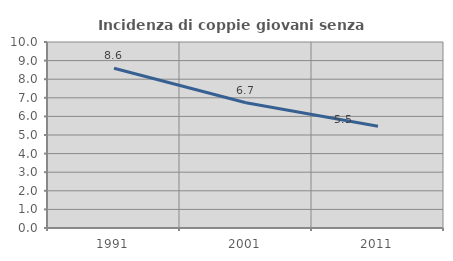
| Category | Incidenza di coppie giovani senza figli |
|---|---|
| 1991.0 | 8.59 |
| 2001.0 | 6.732 |
| 2011.0 | 5.472 |